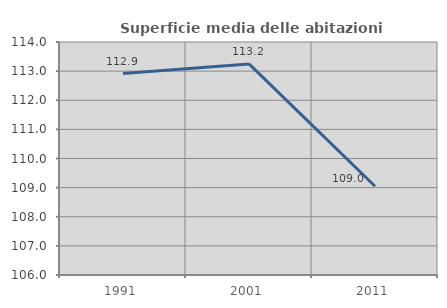
| Category | Superficie media delle abitazioni occupate |
|---|---|
| 1991.0 | 112.916 |
| 2001.0 | 113.247 |
| 2011.0 | 109.047 |